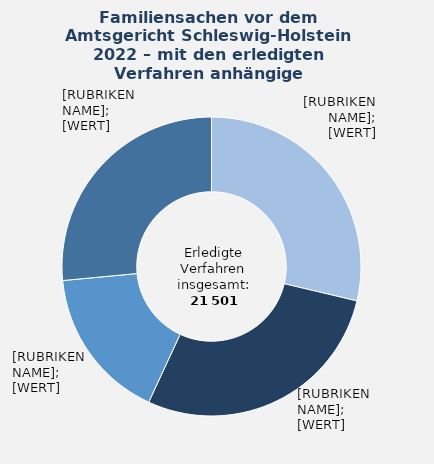
| Category | in Prozent |
|---|---|
| Versorgungsausgleich | 28.7 |
| Scheidung | 28.2 |
| Elterliche Sorge | 16.6 |
| Übrige Verfahrensgegenstände¹  | 26.5 |